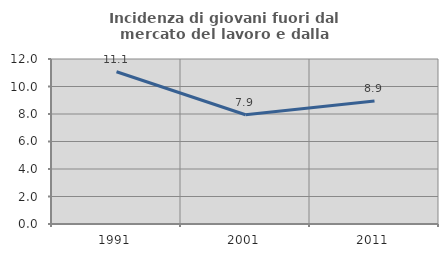
| Category | Incidenza di giovani fuori dal mercato del lavoro e dalla formazione  |
|---|---|
| 1991.0 | 11.074 |
| 2001.0 | 7.944 |
| 2011.0 | 8.939 |